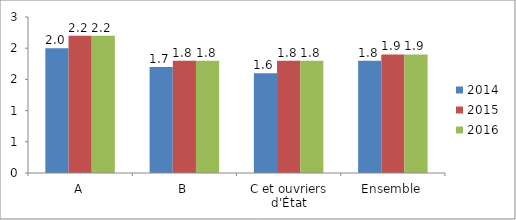
| Category | 2014 | 2015 | 2016 |
|---|---|---|---|
| A | 2 | 2.2 | 2.2 |
| B | 1.7 | 1.8 | 1.8 |
| C et ouvriers d'État | 1.6 | 1.8 | 1.8 |
| Ensemble | 1.8 | 1.9 | 1.9 |